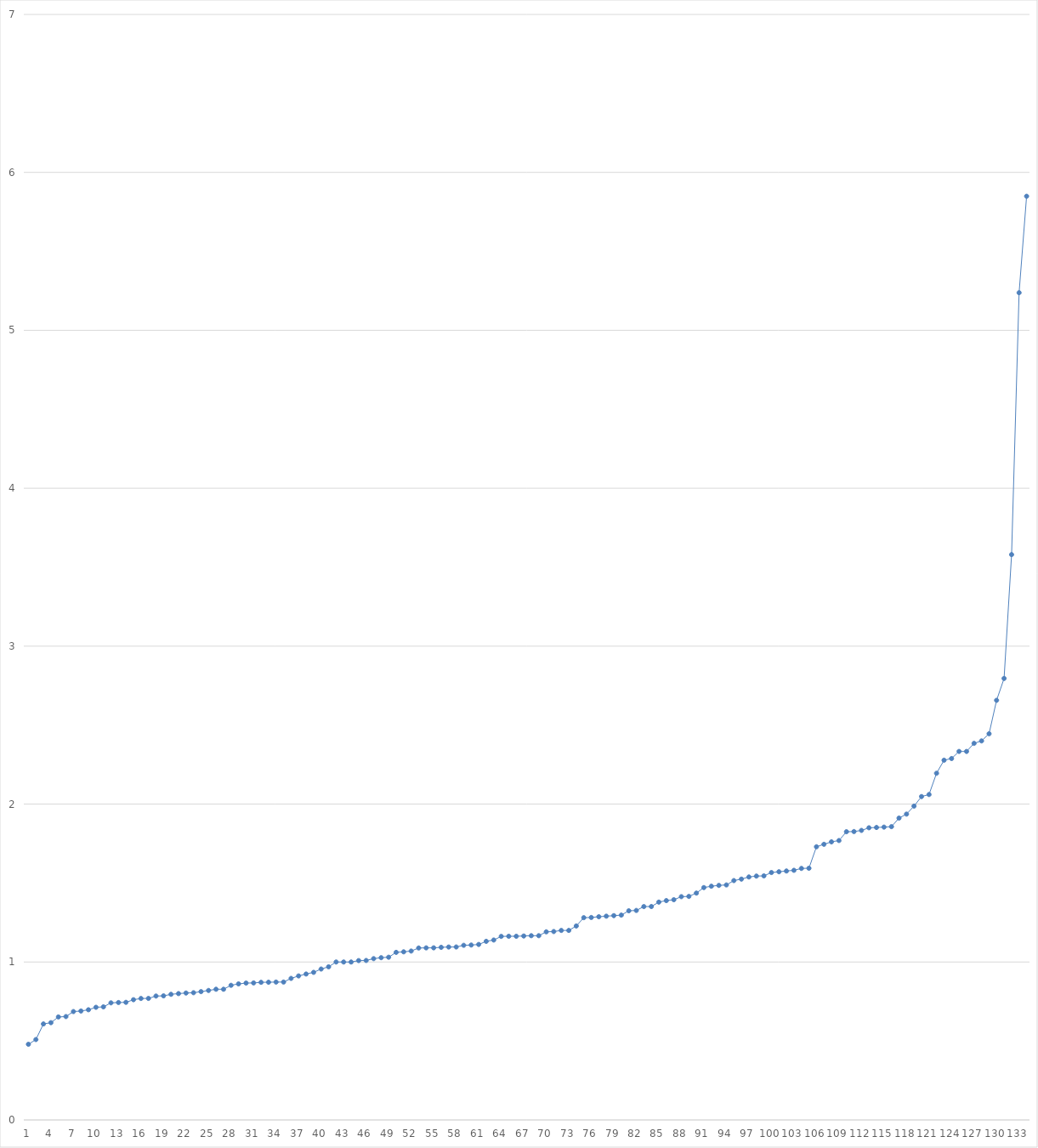
| Category | Series 0 |
|---|---|
| 0 | 0.479 |
| 1 | 0.509 |
| 2 | 0.608 |
| 3 | 0.616 |
| 4 | 0.652 |
| 5 | 0.655 |
| 6 | 0.686 |
| 7 | 0.69 |
| 8 | 0.698 |
| 9 | 0.713 |
| 10 | 0.716 |
| 11 | 0.741 |
| 12 | 0.744 |
| 13 | 0.745 |
| 14 | 0.761 |
| 15 | 0.769 |
| 16 | 0.77 |
| 17 | 0.784 |
| 18 | 0.786 |
| 19 | 0.795 |
| 20 | 0.8 |
| 21 | 0.804 |
| 22 | 0.806 |
| 23 | 0.812 |
| 24 | 0.82 |
| 25 | 0.828 |
| 26 | 0.828 |
| 27 | 0.852 |
| 28 | 0.862 |
| 29 | 0.867 |
| 30 | 0.868 |
| 31 | 0.871 |
| 32 | 0.872 |
| 33 | 0.873 |
| 34 | 0.873 |
| 35 | 0.896 |
| 36 | 0.912 |
| 37 | 0.924 |
| 38 | 0.935 |
| 39 | 0.956 |
| 40 | 0.97 |
| 41 | 1 |
| 42 | 1 |
| 43 | 1 |
| 44 | 1.009 |
| 45 | 1.01 |
| 46 | 1.021 |
| 47 | 1.027 |
| 48 | 1.03 |
| 49 | 1.061 |
| 50 | 1.065 |
| 51 | 1.069 |
| 52 | 1.089 |
| 53 | 1.09 |
| 54 | 1.09 |
| 55 | 1.093 |
| 56 | 1.095 |
| 57 | 1.095 |
| 58 | 1.106 |
| 59 | 1.108 |
| 60 | 1.111 |
| 61 | 1.131 |
| 62 | 1.139 |
| 63 | 1.162 |
| 64 | 1.163 |
| 65 | 1.163 |
| 66 | 1.165 |
| 67 | 1.167 |
| 68 | 1.167 |
| 69 | 1.191 |
| 70 | 1.193 |
| 71 | 1.2 |
| 72 | 1.2 |
| 73 | 1.228 |
| 74 | 1.281 |
| 75 | 1.282 |
| 76 | 1.287 |
| 77 | 1.29 |
| 78 | 1.294 |
| 79 | 1.297 |
| 80 | 1.324 |
| 81 | 1.327 |
| 82 | 1.351 |
| 83 | 1.351 |
| 84 | 1.379 |
| 85 | 1.389 |
| 86 | 1.394 |
| 87 | 1.414 |
| 88 | 1.415 |
| 89 | 1.436 |
| 90 | 1.471 |
| 91 | 1.48 |
| 92 | 1.485 |
| 93 | 1.488 |
| 94 | 1.516 |
| 95 | 1.525 |
| 96 | 1.538 |
| 97 | 1.544 |
| 98 | 1.545 |
| 99 | 1.567 |
| 100 | 1.571 |
| 101 | 1.576 |
| 102 | 1.581 |
| 103 | 1.593 |
| 104 | 1.594 |
| 105 | 1.73 |
| 106 | 1.745 |
| 107 | 1.761 |
| 108 | 1.769 |
| 109 | 1.825 |
| 110 | 1.826 |
| 111 | 1.833 |
| 112 | 1.85 |
| 113 | 1.852 |
| 114 | 1.854 |
| 115 | 1.857 |
| 116 | 1.911 |
| 117 | 1.937 |
| 118 | 1.987 |
| 119 | 2.048 |
| 120 | 2.061 |
| 121 | 2.195 |
| 122 | 2.278 |
| 123 | 2.288 |
| 124 | 2.333 |
| 125 | 2.333 |
| 126 | 2.385 |
| 127 | 2.4 |
| 128 | 2.445 |
| 129 | 2.657 |
| 130 | 2.795 |
| 131 | 3.58 |
| 132 | 5.238 |
| 133 | 5.849 |